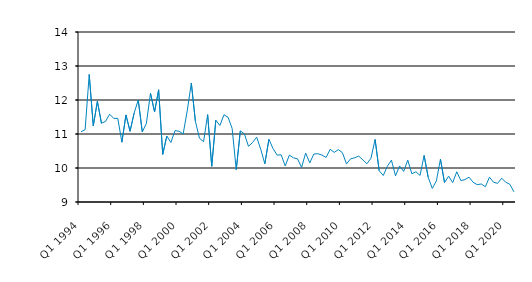
| Category | Series 0 |
|---|---|
| Q1 1994 | 11.067 |
| Q2 1994 | 11.129 |
| Q3 1994 | 12.75 |
| Q4 1994 | 11.238 |
| Q1 1995 | 11.961 |
| Q2 1995 | 11.316 |
| Q3 1995 | 11.37 |
| Q4 1995 | 11.583 |
| Q1 1996 | 11.46 |
| Q2 1996 | 11.458 |
| Q3 1996 | 10.759 |
| Q4 1996 | 11.56 |
| Q1 1997 | 11.08 |
| Q2 1997 | 11.616 |
| Q3 1997 | 12 |
| Q4 1997 | 11.059 |
| Q1 1998 | 11.312 |
| Q2 1998 | 12.199 |
| Q3 1998 | 11.649 |
| Q4 1998 | 12.3 |
| Q1 1999 | 10.4 |
| Q2 1999 | 10.939 |
| Q3 1999 | 10.75 |
| Q4 1999 | 11.1 |
| Q1 2000 | 11.08 |
| Q2 2000 | 11 |
| Q3 2000 | 11.679 |
| Q4 2000 | 12.5 |
| Q1 2001 | 11.375 |
| Q2 2001 | 10.875 |
| Q3 2001 | 10.775 |
| Q4 2001 | 11.57 |
| Q1 2002 | 10.05 |
| Q2 2002 | 11.405 |
| Q3 2002 | 11.25 |
| Q4 2002 | 11.566 |
| Q1 2003 | 11.492 |
| Q2 2003 | 11.162 |
| Q3 2003 | 9.95 |
| Q4 2003 | 11.091 |
| Q1 2004 | 11 |
| Q2 2004 | 10.638 |
| Q3 2004 | 10.75 |
| Q4 2004 | 10.908 |
| Q1 2005 | 10.55 |
| Q2 2005 | 10.125 |
| Q3 2005 | 10.843 |
| Q4 2005 | 10.573 |
| Q1 2006 | 10.38 |
| Q2 2006 | 10.387 |
| Q3 2006 | 10.06 |
| Q4 2006 | 10.38 |
| Q1 2007 | 10.3 |
| Q2 2007 | 10.27 |
| Q3 2007 | 10.017 |
| Q4 2007 | 10.44 |
| Q1 2008 | 10.15 |
| Q2 2008 | 10.41 |
| Q3 2008 | 10.42 |
| Q4 2008 | 10.38 |
| Q1 2009 | 10.31 |
| Q2 2009 | 10.55 |
| Q3 2009 | 10.46 |
| Q4 2009 | 10.54 |
| Q1 2010 | 10.45 |
| Q2 2010 | 10.12 |
| Q3 2010 | 10.27 |
| Q4 2010 | 10.3 |
| Q1 2011 | 10.35 |
| Q2 2011 | 10.24 |
| Q3 2011 | 10.125 |
| Q4 2011 | 10.29 |
| Q1 2012 | 10.84 |
| Q2 2012 | 9.92 |
| Q3 2012 | 9.78 |
| Q4 2012 | 10.05 |
| Q1 2013 | 10.23 |
| Q2 2013 | 9.77 |
| Q3 2013 | 10.06 |
| Q4 2013 | 9.9 |
| Q1 2014 | 10.23 |
| Q2 2014 | 9.83 |
| Q3 2014 | 9.89 |
| Q4 2014 | 9.78 |
| Q1 2015 | 10.37 |
| Q2 2015 | 9.726 |
| Q3 2015 | 9.4 |
| Q4 2015 | 9.62 |
| Q1 2016 | 10.26 |
| Q2 2016 | 9.57 |
| Q3 2016 | 9.76 |
| Q4 2016 | 9.57 |
| Q1 2017 | 9.89 |
| Q2 2017 | 9.63 |
| Q3 2017 | 9.66 |
| Q4 2017 | 9.73 |
| Q1 2018 | 9.58 |
| Q2 2018 | 9.51 |
| Q3 2018 | 9.53 |
| Q4 2018 | 9.45 |
| Q1 2019 | 9.73 |
| Q2 2019 | 9.58 |
| Q3 2019 | 9.55 |
| Q4 2019 | 9.7 |
| Q1 2020 | 9.58 |
| Q2 2020 | 9.52 |
| Q3 2020 | 9.3 |